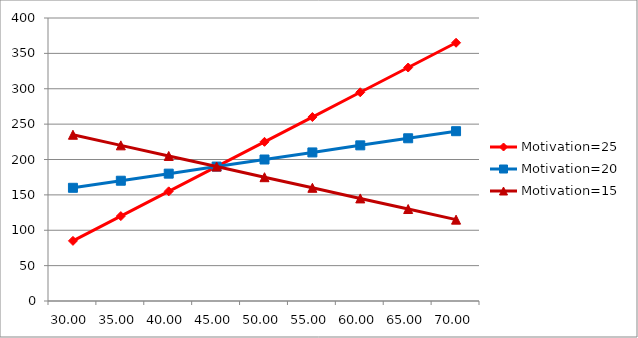
| Category | Motivation=25 | Motivation=20 | Motivation=15 |
|---|---|---|---|
| 30.0 | 85 | 160 | 235 |
| 35.0 | 120 | 170 | 220 |
| 40.0 | 155 | 180 | 205 |
| 45.0 | 190 | 190 | 190 |
| 50.0 | 225 | 200 | 175 |
| 55.0 | 260 | 210 | 160 |
| 60.0 | 295 | 220 | 145 |
| 65.0 | 330 | 230 | 130 |
| 70.0 | 365 | 240 | 115 |